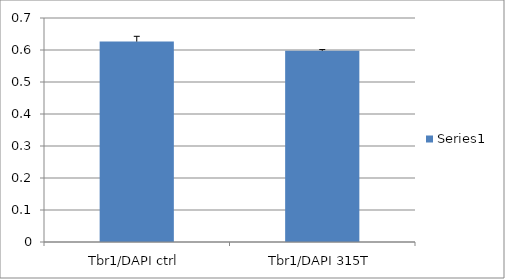
| Category | Series 0 |
|---|---|
| Tbr1/DAPI ctrl | 0.626 |
| Tbr1/DAPI 315T | 0.597 |